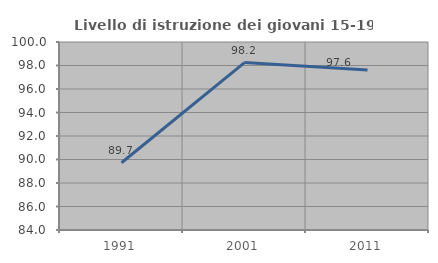
| Category | Livello di istruzione dei giovani 15-19 anni |
|---|---|
| 1991.0 | 89.726 |
| 2001.0 | 98.246 |
| 2011.0 | 97.619 |